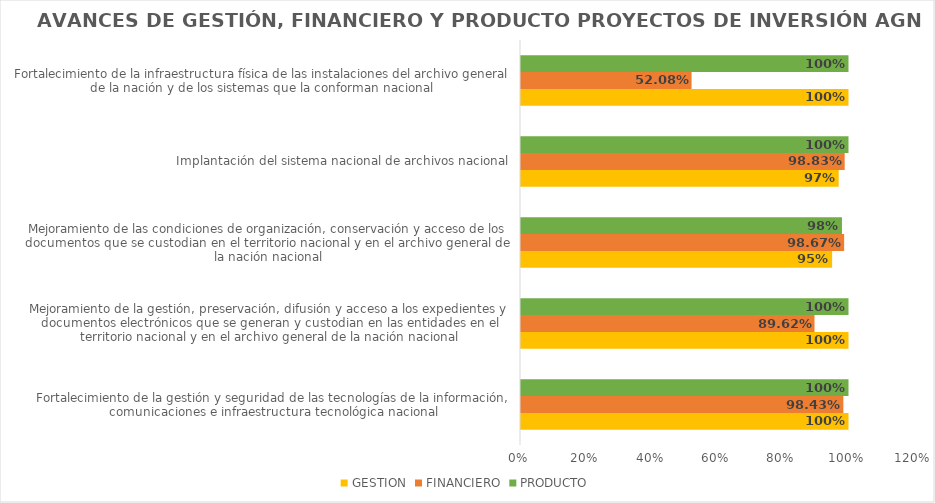
| Category | GESTION | FINANCIERO | PRODUCTO |
|---|---|---|---|
| Fortalecimiento de la gestión y seguridad de las tecnologías de la información, comunicaciones e infraestructura tecnológica nacional | 1 | 0.984 | 1 |
| Mejoramiento de la gestión, preservación, difusión y acceso a los expedientes y documentos electrónicos que se generan y custodian en las entidades en el territorio nacional y en el archivo general de la nación nacional | 1 | 0.896 | 1 |
| Mejoramiento de las condiciones de organización, conservación y acceso de los documentos que se custodian en el territorio nacional y en el archivo general de la nación nacional | 0.95 | 0.987 | 0.98 |
| Implantación del sistema nacional de archivos nacional | 0.97 | 0.988 | 1 |
| Fortalecimiento de la infraestructura física de las instalaciones del archivo general de la nación y de los sistemas que la conforman nacional | 1 | 0.521 | 1 |